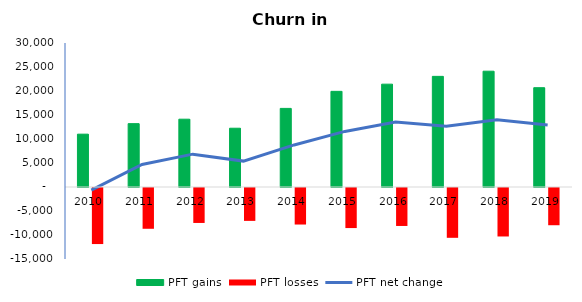
| Category | PFT gains | PFT losses |
|---|---|---|
| 2010.0 | 11009 | -11678 |
| 2011.0 | 13198 | -8495 |
| 2012.0 | 14126 | -7282 |
| 2013.0 | 12245 | -6851 |
| 2014.0 | 16375 | -7611 |
| 2015.0 | 19926 | -8347 |
| 2016.0 | 21425 | -7910 |
| 2017.0 | 23047 | -10377 |
| 2018.0 | 24125 | -10099 |
| 2019.0 | 20691 | -7756 |